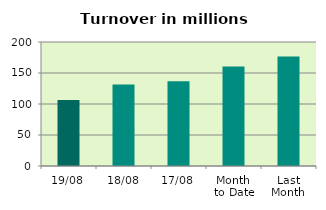
| Category | Series 0 |
|---|---|
| 19/08 | 106.648 |
| 18/08 | 131.402 |
| 17/08 | 136.858 |
| Month 
to Date | 160.589 |
| Last
Month | 176.477 |